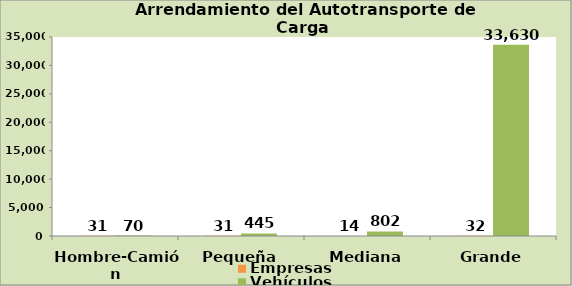
| Category | Empresas | Vehículos |
|---|---|---|
| Hombre-Camión | 31 | 70 |
| Pequeña | 31 | 445 |
| Mediana | 14 | 802 |
| Grande | 32 | 33630 |